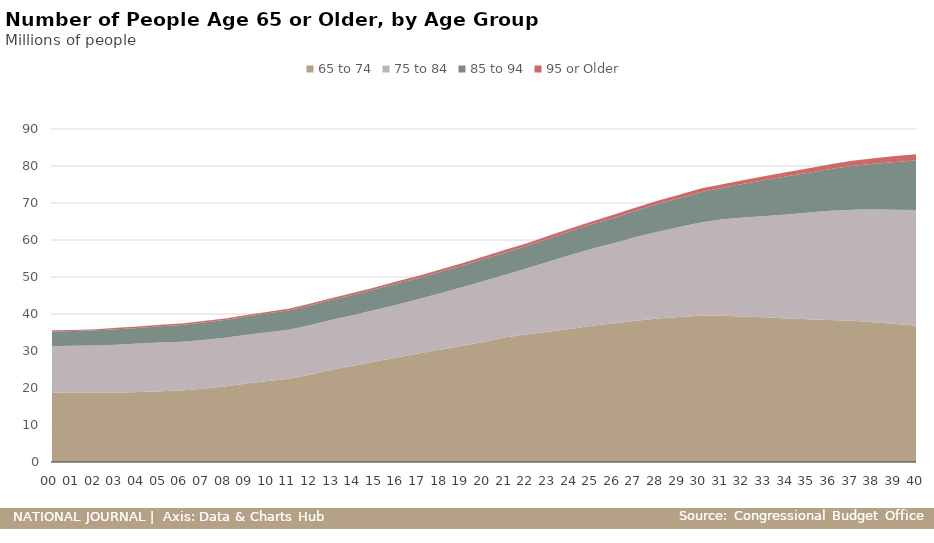
| Category | 65 to 74 | 75 to 84 | 85 to 94 | 95 or Older |
|---|---|---|---|---|
| 00 | 18.8 | 12.5 | 4 | 0.3 |
| 01 | 18.7 | 12.7 | 4 | 0.3 |
| 02 | 18.7 | 12.8 | 4.1 | 0.3 |
| 03 | 18.7 | 13 | 4.2 | 0.4 |
| 04 | 18.9 | 13.1 | 4.2 | 0.4 |
| 05 | 19.1 | 13.2 | 4.4 | 0.4 |
| 06 | 19.3 | 13.2 | 4.5 | 0.4 |
| 07 | 19.8 | 13.2 | 4.7 | 0.4 |
| 08 | 20.4 | 13.2 | 4.8 | 0.4 |
| 09 | 21.2 | 13.2 | 4.9 | 0.4 |
| 10 | 21.9 | 13.2 | 5.1 | 0.4 |
| 11 | 22.5 | 13.3 | 5.2 | 0.5 |
| 12 | 23.7 | 13.4 | 5.3 | 0.5 |
| 13 | 25 | 13.5 | 5.4 | 0.5 |
| 14 | 26.1 | 13.7 | 5.5 | 0.5 |
| 15 | 27.2 | 14 | 5.6 | 0.5 |
| 16 | 28.3 | 14.3 | 5.7 | 0.6 |
| 17 | 29.4 | 14.7 | 5.7 | 0.6 |
| 18 | 30.4 | 15.3 | 5.8 | 0.6 |
| 19 | 31.4 | 15.9 | 5.8 | 0.7 |
| 20 | 32.5 | 16.5 | 5.9 | 0.7 |
| 21 | 33.7 | 17 | 6 | 0.7 |
| 22 | 34.5 | 17.9 | 6.1 | 0.7 |
| 23 | 35.2 | 19 | 6.2 | 0.8 |
| 24 | 36 | 20 | 6.4 | 0.8 |
| 25 | 36.8 | 20.9 | 6.6 | 0.8 |
| 26 | 37.5 | 21.7 | 6.8 | 0.9 |
| 27 | 38.2 | 22.6 | 7.1 | 0.9 |
| 28 | 38.8 | 23.4 | 7.5 | 0.9 |
| 29 | 39.2 | 24.3 | 7.8 | 0.9 |
| 30 | 39.5 | 25.2 | 8.2 | 1 |
| 31 | 39.5 | 26.1 | 8.5 | 1 |
| 32 | 39.3 | 26.8 | 9.1 | 1 |
| 33 | 39.1 | 27.4 | 9.7 | 1.1 |
| 34 | 38.8 | 28.1 | 10.3 | 1.2 |
| 35 | 38.6 | 28.8 | 10.8 | 1.2 |
| 36 | 38.4 | 29.5 | 11.3 | 1.3 |
| 37 | 38.2 | 30 | 11.8 | 1.4 |
| 38 | 37.8 | 30.5 | 12.3 | 1.5 |
| 39 | 37.3 | 30.9 | 12.9 | 1.6 |
| 40 | 36.9 | 31.2 | 13.4 | 1.7 |